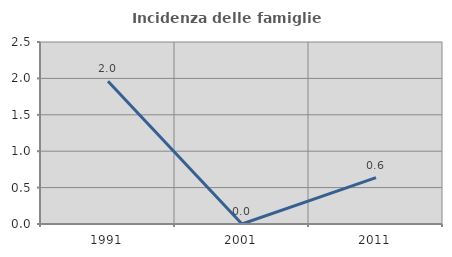
| Category | Incidenza delle famiglie numerose |
|---|---|
| 1991.0 | 1.961 |
| 2001.0 | 0 |
| 2011.0 | 0.637 |